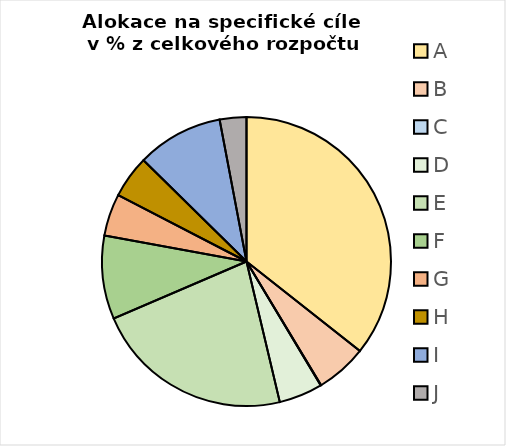
| Category | Series 0 |
|---|---|
| A | 0.356 |
| B | 0.057 |
| C | 0 |
| D | 0.049 |
| E | 0.222 |
| F | 0.093 |
| G | 0.047 |
| H | 0.048 |
| I | 0.097 |
| J | 0.03 |